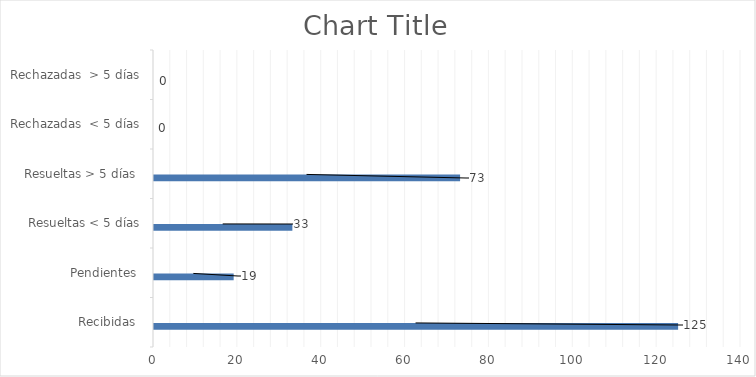
| Category | Física | PORTAL SAIP | 311 | Otras |
|---|---|---|---|---|
| Recibidas  | 0 | 125 | 0 | 0 |
| Pendientes  | 0 | 19 | 0 | 0 |
| Resueltas < 5 días | 0 | 33 | 0 | 0 |
| Resueltas > 5 días  | 0 | 73 | 0 | 0 |
| Rechazadas  < 5 días | 0 | 0 | 0 | 0 |
| Rechazadas  > 5 días | 0 | 0 | 0 | 0 |